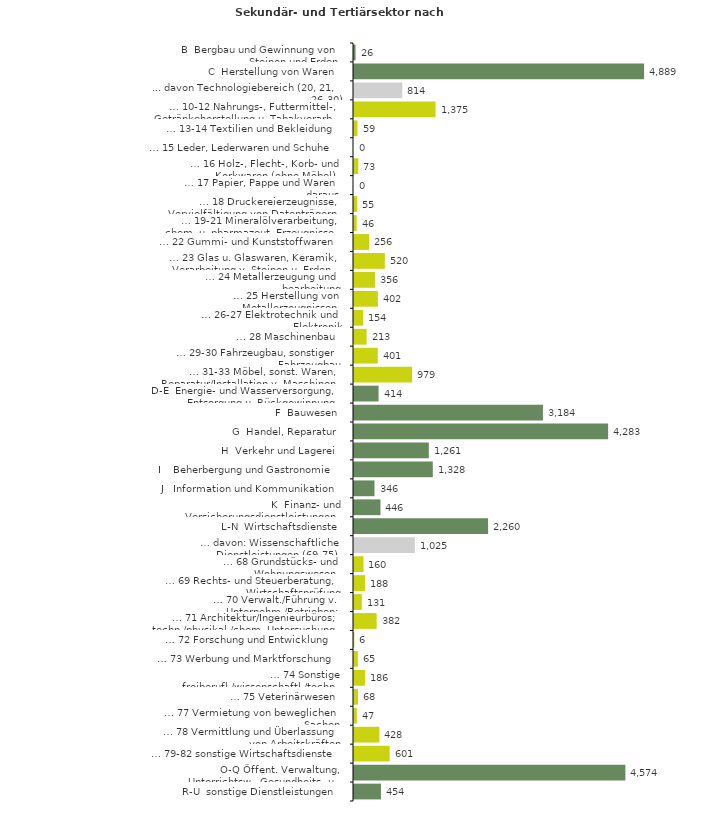
| Category | Series 0 |
|---|---|
| B  Bergbau und Gewinnung von Steinen und Erden | 26 |
| C  Herstellung von Waren | 4889 |
| ... davon Technologiebereich (20, 21, 26-30) | 814 |
| … 10-12 Nahrungs-, Futtermittel-, Getränkeherstellung u. Tabakverarb. | 1375 |
| … 13-14 Textilien und Bekleidung | 59 |
| … 15 Leder, Lederwaren und Schuhe | 0 |
| … 16 Holz-, Flecht-, Korb- und Korkwaren (ohne Möbel)  | 73 |
| … 17 Papier, Pappe und Waren daraus  | 0 |
| … 18 Druckereierzeugnisse, Vervielfältigung von Datenträgern | 55 |
| … 19-21 Mineralölverarbeitung, chem. u. pharmazeut. Erzeugnisse | 46 |
| … 22 Gummi- und Kunststoffwaren | 256 |
| … 23 Glas u. Glaswaren, Keramik, Verarbeitung v. Steinen u. Erden  | 520 |
| … 24 Metallerzeugung und -bearbeitung | 356 |
| … 25 Herstellung von Metallerzeugnissen  | 402 |
| … 26-27 Elektrotechnik und Elektronik | 154 |
| … 28 Maschinenbau | 213 |
| … 29-30 Fahrzeugbau, sonstiger Fahrzeugbau | 401 |
| … 31-33 Möbel, sonst. Waren, Reparatur/Installation v. Maschinen | 979 |
| D-E  Energie- und Wasserversorgung, Entsorgung u. Rückgewinnung | 414 |
| F  Bauwesen | 3184 |
| G  Handel, Reparatur | 4283 |
| H  Verkehr und Lagerei | 1261 |
| I    Beherbergung und Gastronomie | 1328 |
| J   Information und Kommunikation | 346 |
| K  Finanz- und Versicherungsdienstleistungen | 446 |
| L-N  Wirtschaftsdienste | 2260 |
| … davon: Wissenschaftliche Dienstleistungen (69-75) | 1025 |
| … 68 Grundstücks- und Wohnungswesen  | 160 |
| … 69 Rechts- und Steuerberatung, Wirtschaftsprüfung | 188 |
| … 70 Verwalt./Führung v. Unternehm./Betrieben; Unternehmensberat. | 131 |
| … 71 Architektur/Ingenieurbüros; techn./physikal./chem. Untersuchung | 382 |
| … 72 Forschung und Entwicklung  | 6 |
| … 73 Werbung und Marktforschung | 65 |
| … 74 Sonstige freiberufl./wissenschaftl./techn. Tätigkeiten | 186 |
| … 75 Veterinärwesen | 68 |
| … 77 Vermietung von beweglichen Sachen  | 47 |
| … 78 Vermittlung und Überlassung von Arbeitskräften | 428 |
| … 79-82 sonstige Wirtschaftsdienste | 601 |
| O-Q Öffent. Verwaltung, Unterrichtsw., Gesundheits- u. Sozialwesen | 4574 |
| R-U  sonstige Dienstleistungen | 454 |